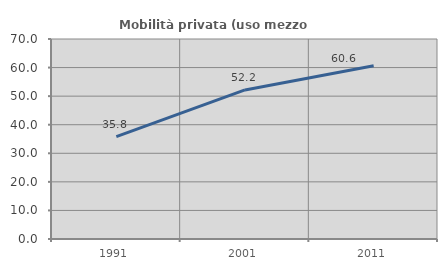
| Category | Mobilità privata (uso mezzo privato) |
|---|---|
| 1991.0 | 35.841 |
| 2001.0 | 52.178 |
| 2011.0 | 60.627 |